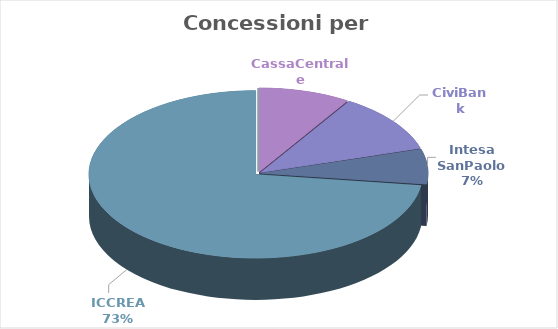
| Category | Series 0 |
|---|---|
| CassaCentrale | 1185000 |
| CiviBank | 1525500 |
| Intesa SanPaolo  | 900000 |
| ICCREA | 9729000 |
| Unicredit | 0 |
| Credit Agricole | 0 |